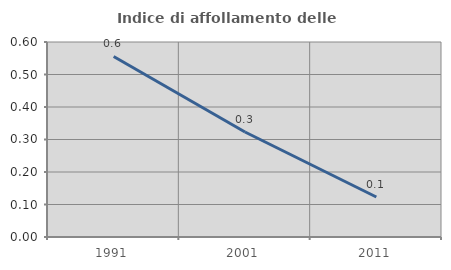
| Category | Indice di affollamento delle abitazioni  |
|---|---|
| 1991.0 | 0.556 |
| 2001.0 | 0.323 |
| 2011.0 | 0.123 |